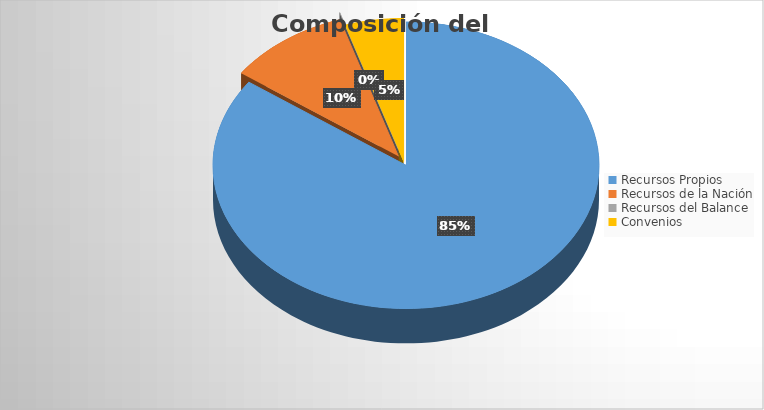
| Category | Series 0 |
|---|---|
| Recursos Propios | 51152127111.386 |
| Recursos de la Nación | 6173307563.38 |
| Recursos del Balance | 0 |
| Convenios | 2958626780 |